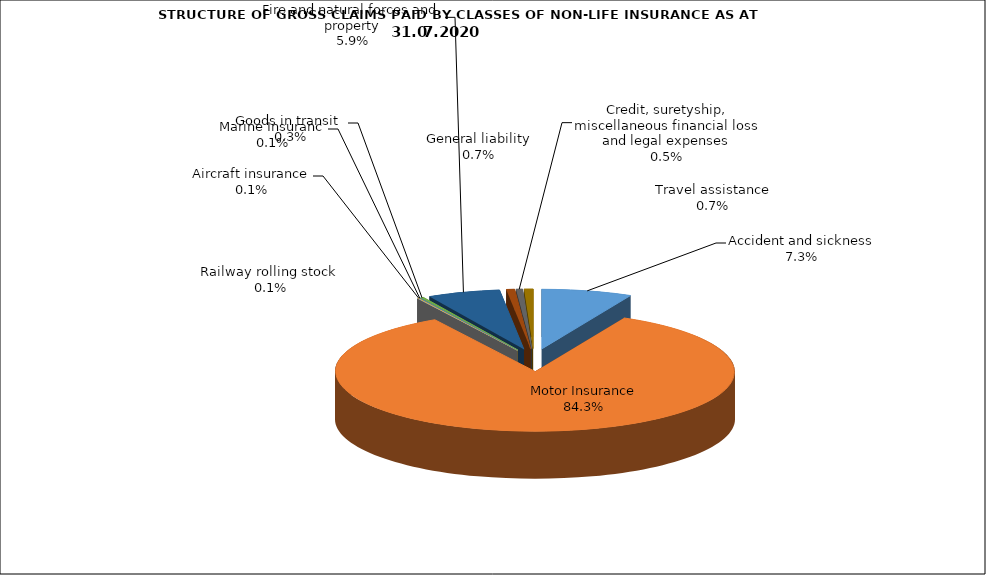
| Category | Accident and sickness | Series 1 |
|---|---|---|
| Accident and sickness | 0.073 |  |
| Motor Insurance | 0.843 |  |
| Railway rolling stock  | 0.001 |  |
| Aircraft insurance | 0.001 |  |
| Marine Insuranc | 0.001 |  |
| Goods in transit  | 0.003 |  |
| Fire and natural forces and property | 0.059 |  |
| General liability | 0.007 |  |
| Credit, suretyship, miscellaneous financial loss and legal expenses | 0.005 |  |
| Travel assistance | 0.007 |  |